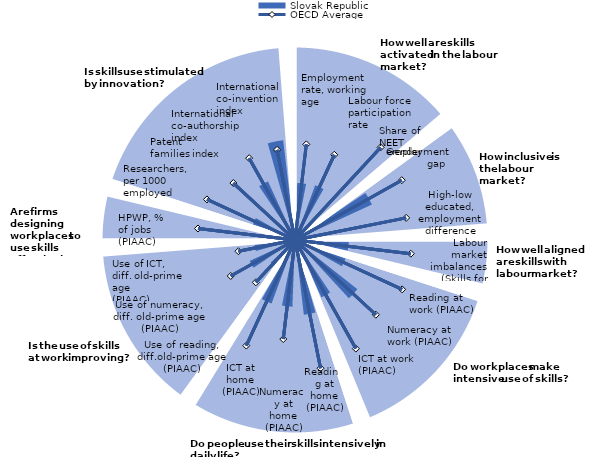
| Category | Outer circle | Slovak Republic |
|---|---|---|
| 0 | 16 | 0 |
| 1 | 16 | 4.713 |
| 2 | 16 | 4.713 |
| 3 | 16 | 4.713 |
| 4 | 16 | 4.713 |
| 5 | 16 | 4.713 |
| 6 | 16 | 0 |
| 7 | 16 | 0 |
| 8 | 16 | 0 |
| 9 | 16 | 4.811 |
| 10 | 16 | 4.811 |
| 11 | 16 | 4.811 |
| 12 | 16 | 4.811 |
| 13 | 16 | 4.811 |
| 14 | 16 | 0 |
| 15 | 16 | 0 |
| 16 | 16 | 0 |
| 17 | 16 | 0 |
| 18 | 16 | 0 |
| 19 | 16 | 0 |
| 20 | 16 | 0 |
| 21 | 16 | 0 |
| 22 | 16 | 0 |
| 23 | 0 | 0 |
| 24 | 16 | 0 |
| 25 | 16 | 6.981 |
| 26 | 16 | 6.981 |
| 27 | 16 | 6.981 |
| 28 | 16 | 6.981 |
| 29 | 16 | 6.981 |
| 30 | 16 | 0 |
| 31 | 16 | 0 |
| 32 | 16 | 0 |
| 33 | 16 | 0.404 |
| 34 | 16 | 0.404 |
| 35 | 16 | 0.404 |
| 36 | 16 | 0.404 |
| 37 | 16 | 0.404 |
| 38 | 16 | 0 |
| 39 | 0 | 0 |
| 40 | 16 | 0 |
| 41 | 16 | 4.434 |
| 42 | 16 | 4.434 |
| 43 | 16 | 4.434 |
| 44 | 16 | 4.434 |
| 45 | 16 | 4.434 |
| 46 | 16 | 0 |
| 47 | 0 | 0 |
| 48 | 16 | 0 |
| 49 | 16 | 4.437 |
| 50 | 16 | 4.437 |
| 51 | 16 | 4.437 |
| 52 | 16 | 4.437 |
| 53 | 16 | 4.437 |
| 54 | 16 | 0 |
| 55 | 16 | 0 |
| 56 | 16 | 0 |
| 57 | 16 | 6.548 |
| 58 | 16 | 6.548 |
| 59 | 16 | 6.548 |
| 60 | 16 | 6.548 |
| 61 | 16 | 6.548 |
| 62 | 16 | 0 |
| 63 | 16 | 0 |
| 64 | 16 | 0 |
| 65 | 16 | 5.206 |
| 66 | 16 | 5.206 |
| 67 | 16 | 5.206 |
| 68 | 16 | 5.206 |
| 69 | 16 | 5.206 |
| 70 | 16 | 0 |
| 71 | 0 | 0 |
| 72 | 16 | 0 |
| 73 | 16 | 6.208 |
| 74 | 16 | 6.208 |
| 75 | 16 | 6.208 |
| 76 | 16 | 6.208 |
| 77 | 16 | 6.208 |
| 78 | 16 | 0 |
| 79 | 16 | 0 |
| 80 | 16 | 0 |
| 81 | 16 | 5.505 |
| 82 | 16 | 5.505 |
| 83 | 16 | 5.505 |
| 84 | 16 | 5.505 |
| 85 | 16 | 5.505 |
| 86 | 16 | 0 |
| 87 | 16 | 0 |
| 88 | 16 | 0 |
| 89 | 16 | 5.584 |
| 90 | 16 | 5.584 |
| 91 | 16 | 5.584 |
| 92 | 16 | 5.584 |
| 93 | 16 | 5.584 |
| 94 | 16 | 0 |
| 95 | 0 | 0 |
| 96 | 16 | 0 |
| 97 | 16 | 2.717 |
| 98 | 16 | 2.717 |
| 99 | 16 | 2.717 |
| 100 | 16 | 2.717 |
| 101 | 16 | 2.717 |
| 102 | 16 | 0 |
| 103 | 16 | 0 |
| 104 | 16 | 0 |
| 105 | 16 | 4.109 |
| 106 | 16 | 4.109 |
| 107 | 16 | 4.109 |
| 108 | 16 | 4.109 |
| 109 | 16 | 4.109 |
| 110 | 16 | 0 |
| 111 | 16 | 0 |
| 112 | 16 | 0 |
| 113 | 16 | 3.347 |
| 114 | 16 | 3.347 |
| 115 | 16 | 3.347 |
| 116 | 16 | 3.347 |
| 117 | 16 | 3.347 |
| 118 | 16 | 0 |
| 119 | 0 | 0 |
| 120 | 16 | 0 |
| 121 | 16 | 2.232 |
| 122 | 16 | 2.232 |
| 123 | 16 | 2.232 |
| 124 | 16 | 2.232 |
| 125 | 16 | 2.232 |
| 126 | 16 | 0 |
| 127 | 0 | 0 |
| 128 | 16 | 0 |
| 129 | 16 | 3.695 |
| 130 | 16 | 3.695 |
| 131 | 16 | 3.695 |
| 132 | 16 | 3.695 |
| 133 | 16 | 3.695 |
| 134 | 16 | 0 |
| 135 | 16 | 0 |
| 136 | 16 | 0 |
| 137 | 16 | 1.327 |
| 138 | 16 | 1.327 |
| 139 | 16 | 1.327 |
| 140 | 16 | 1.327 |
| 141 | 16 | 1.327 |
| 142 | 16 | 0 |
| 143 | 16 | 0 |
| 144 | 16 | 0 |
| 145 | 16 | 5.32 |
| 146 | 16 | 5.32 |
| 147 | 16 | 5.32 |
| 148 | 16 | 5.32 |
| 149 | 16 | 5.32 |
| 150 | 16 | 0 |
| 151 | 16 | 0 |
| 152 | 16 | 0 |
| 153 | 16 | 8.285 |
| 154 | 16 | 8.285 |
| 155 | 16 | 8.285 |
| 156 | 16 | 8.285 |
| 157 | 16 | 8.285 |
| 158 | 16 | 0 |
| 159 | 0 | 0 |